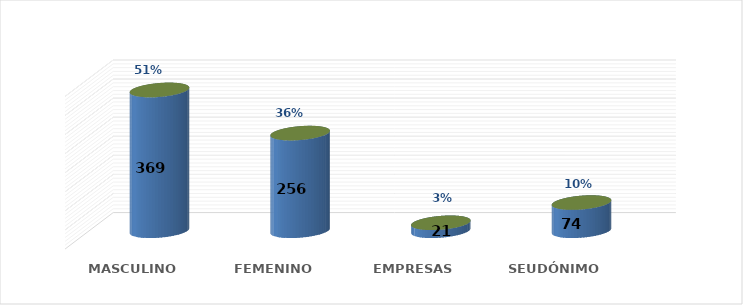
| Category | SOLICITUD POR GÉNERO | Series 1 |
|---|---|---|
| MASCULINO | 369 | 0.512 |
| FEMENINO | 256 | 0.356 |
| EMPRESAS | 21 | 0.029 |
| SEUDÓNIMO | 74 | 0.103 |